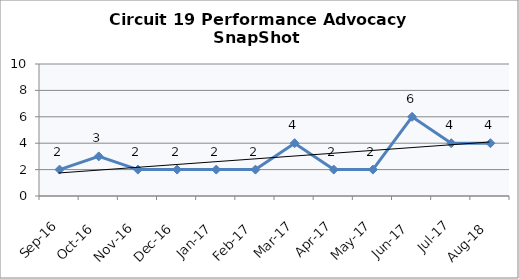
| Category | Circuit 19 |
|---|---|
| Sep-16 | 2 |
| Oct-16 | 3 |
| Nov-16 | 2 |
| Dec-16 | 2 |
| Jan-17 | 2 |
| Feb-17 | 2 |
| Mar-17 | 4 |
| Apr-17 | 2 |
| May-17 | 2 |
| Jun-17 | 6 |
| Jul-17 | 4 |
| Aug-18 | 4 |